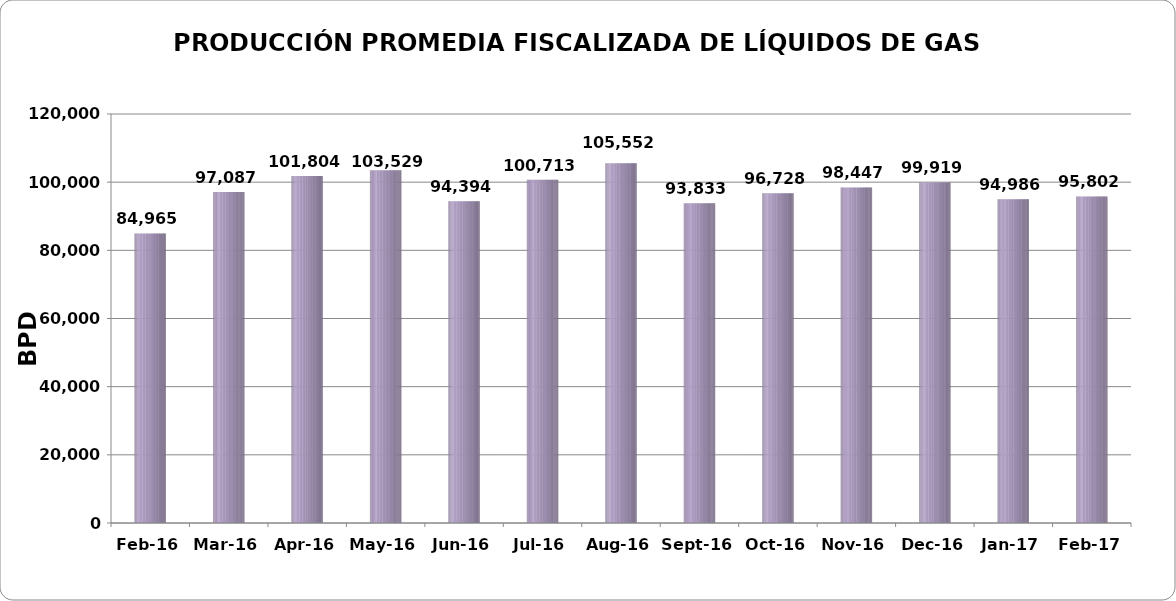
| Category | Series 0 |
|---|---|
| 2016-02-01 | 84964.724 |
| 2016-03-01 | 97087.097 |
| 2016-04-01 | 101803.833 |
| 2016-05-01 | 103529.194 |
| 2016-06-01 | 94393.767 |
| 2016-07-01 | 100713.355 |
| 2016-08-01 | 105552.1 |
| 2016-09-01 | 93833.1 |
| 2016-10-01 | 96727.548 |
| 2016-11-01 | 98446.71 |
| 2016-12-01 | 99919.129 |
| 2017-01-01 | 94986 |
| 2017-02-01 | 95802.107 |